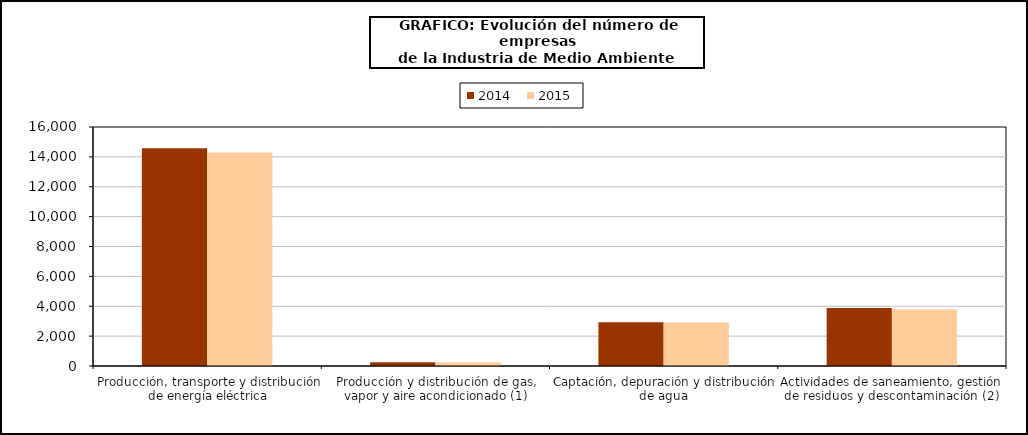
| Category | 2014 | 2015 |
|---|---|---|
| Producción, transporte y distribución de energía eléctrica | 14571 | 14294 |
| Producción y distribución de gas, vapor y aire acondicionado (1) | 255 | 257 |
| Captación, depuración y distribución de agua | 2924 | 2919 |
| Actividades de saneamiento, gestión de residuos y descontaminación (2) | 3878 | 3785 |